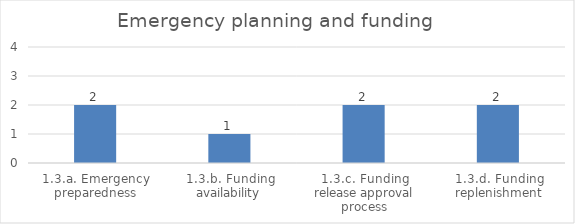
| Category | Emergency planning and funding |
|---|---|
| 1.3.a. Emergency preparedness | 2 |
| 1.3.b. Funding availability | 1 |
| 1.3.c. Funding release approval process | 2 |
| 1.3.d. Funding replenishment | 2 |